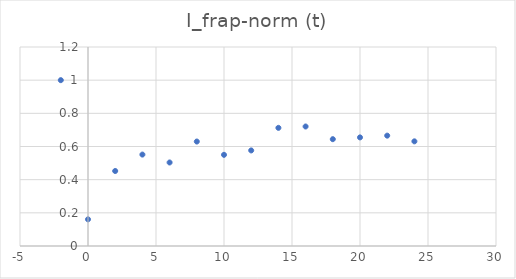
| Category | I_frap-norm (t) |
|---|---|
| -2.0 | 1 |
| 0.0 | 0.161 |
| 2.0 | 0.452 |
| 4.0 | 0.551 |
| 6.0 | 0.504 |
| 8.0 | 0.63 |
| 10.0 | 0.55 |
| 12.0 | 0.576 |
| 14.0 | 0.712 |
| 16.0 | 0.721 |
| 18.0 | 0.644 |
| 20.0 | 0.655 |
| 22.0 | 0.665 |
| 24.0 | 0.631 |